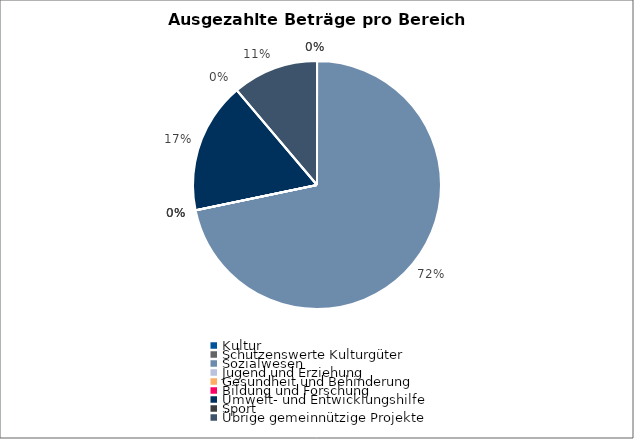
| Category | Series 0 |
|---|---|
| Kultur | 0 |
| Schützenswerte Kulturgüter | 0 |
| Sozialwesen | 352380 |
| Jugend und Erziehung | 0 |
| Gesundheit und Behinderung | 0 |
| Bildung und Forschung | 0 |
| Umwelt- und Entwicklungshilfe | 84000 |
| Sport | 0 |
| Übrige gemeinnützige Projekte | 55000 |